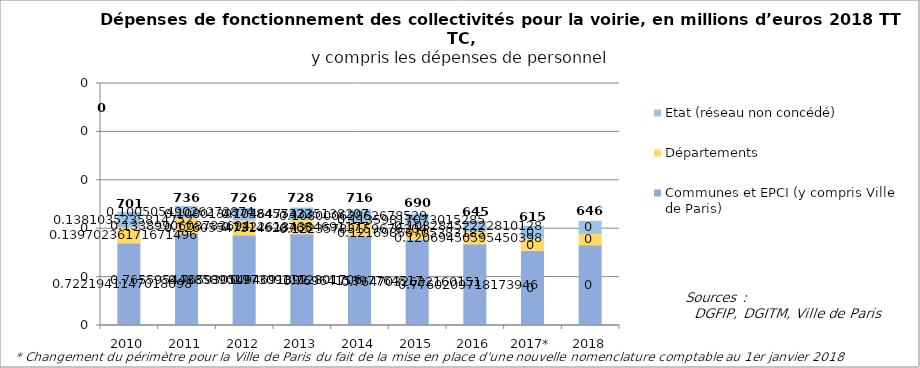
| Category | Communes et EPCI (y compris Ville de Paris) | Départements | Etat (réseau non concédé) |
|---|---|---|---|
| 2010 | 506245820.215 | 97928985.094 | 96808226.69 |
| 2011 | 563670109.335 | 98583264.043 | 73997227.608 |
| 2012 | 555948416.635 | 91496991.147 | 78401624.982 |
| 2013 | 562591220.482 | 88971606.986 | 76153752.332 |
| 2014 | 550721055.661 | 87553790.567 | 77280418.397 |
| 2015 | 527894000.489 | 84011598.472 | 78419690.039 |
| 2016 | 500281641.543 | 77808780.635 | 66584992.162 |
| 2017* | 460741481.653 | 74771088.072 | 79834409.177 |
| 2018 | 495056756.634 | 69908317.43 | 80893918.632 |